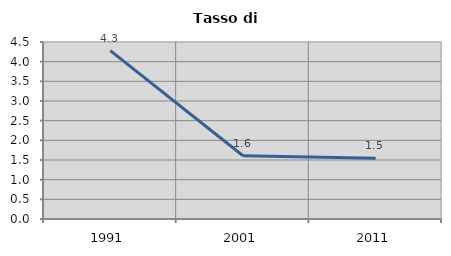
| Category | Tasso di disoccupazione   |
|---|---|
| 1991.0 | 4.28 |
| 2001.0 | 1.607 |
| 2011.0 | 1.544 |